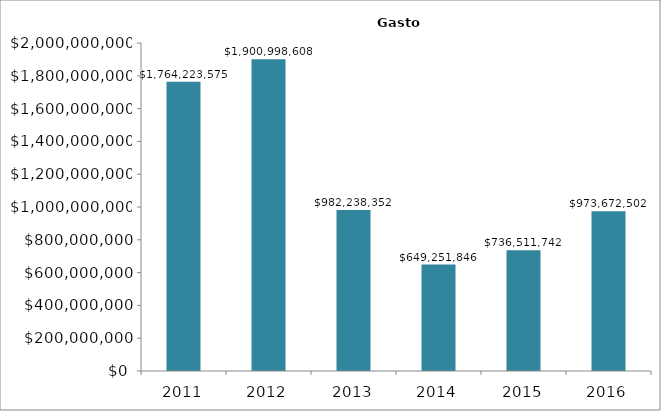
| Category | Series 0 |
|---|---|
| 2011.0 | 1764223575 |
| 2012.0 | 1900998608 |
| 2013.0 | 982238352 |
| 2014.0 | 649251846 |
| 2015.0 | 736511742 |
| 2016.0 | 973672502 |